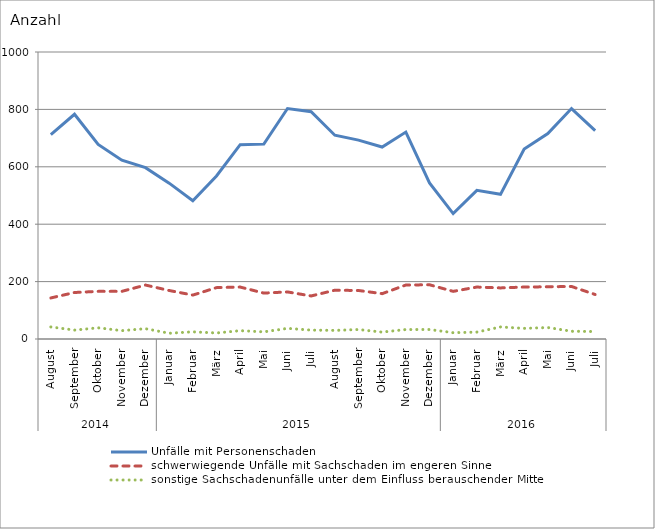
| Category | Unfälle mit Personenschaden | schwerwiegende Unfälle mit Sachschaden im engeren Sinne | sonstige Sachschadenunfälle unter dem Einfluss berauschender Mittel |
|---|---|---|---|
| 0 | 712 | 143 | 42 |
| 1 | 783 | 162 | 31 |
| 2 | 678 | 166 | 39 |
| 3 | 623 | 166 | 29 |
| 4 | 597 | 188 | 36 |
| 5 | 543 | 169 | 20 |
| 6 | 482 | 153 | 25 |
| 7 | 568 | 179 | 21 |
| 8 | 677 | 181 | 29 |
| 9 | 679 | 160 | 25 |
| 10 | 803 | 164 | 37 |
| 11 | 792 | 150 | 31 |
| 12 | 710 | 170 | 30 |
| 13 | 693 | 169 | 33 |
| 14 | 669 | 158 | 24 |
| 15 | 721 | 188 | 33 |
| 16 | 544 | 189 | 33 |
| 17 | 437 | 166 | 22 |
| 18 | 518 | 181 | 24 |
| 19 | 504 | 178 | 42 |
| 20 | 662 | 181 | 37 |
| 21 | 716 | 182 | 40 |
| 22 | 803 | 183 | 27 |
| 23 | 726 | 155 | 26 |